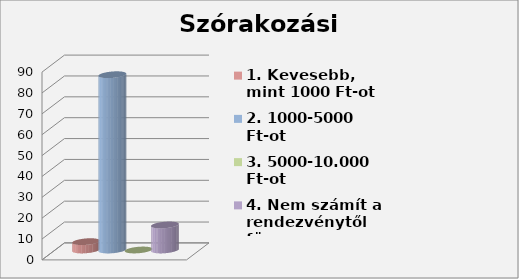
| Category | 1. Kevesebb, mint 1000 Ft-ot | 2. 1000-5000 Ft-ot | 3. 5000-10.000 Ft-ot | 4. Nem számít a rendezvénytől függ |
|---|---|---|---|---|
| 0 | 4 | 84 | 0 | 12 |